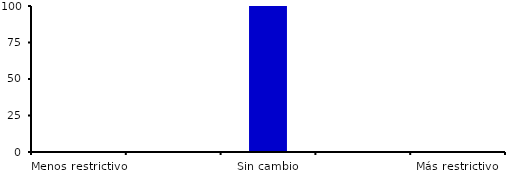
| Category | Series 0 |
|---|---|
| Menos restrictivo | 0 |
| Moderadamente menos restrictivo | 0 |
| Sin cambio | 100 |
| Moderadamente más restrictivo | 0 |
| Más restrictivo | 0 |